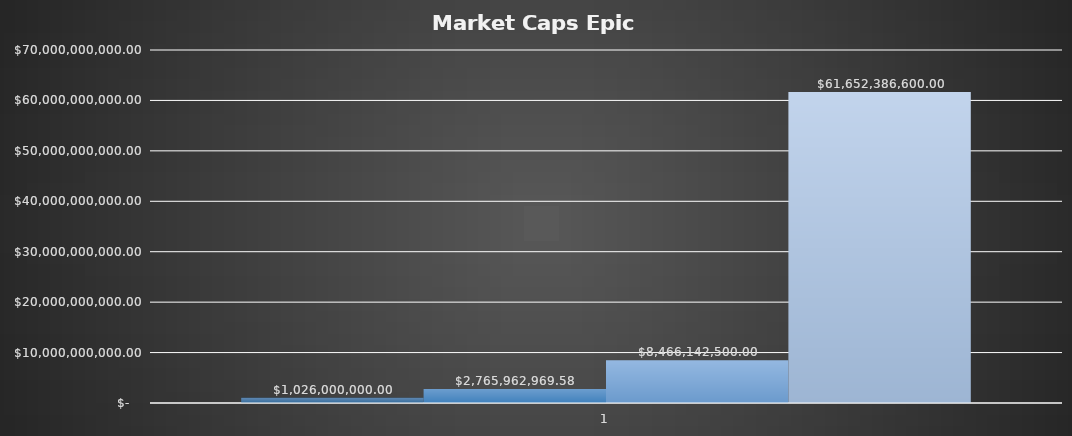
| Category | Series 0 | Series 1 | Series 2 | Series 3 |
|---|---|---|---|---|
| 0 | 1026000000 | 2765962969.582 | 8466142500 | 61652386600 |